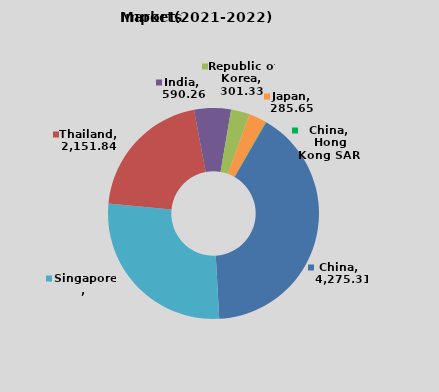
| Category | Series 0 |
|---|---|
| China | 4275.31 |
| Singapore | 2867.77 |
| Thailand | 2151.84 |
| India | 590.26 |
| Republic of  Korea | 301.33 |
| Japan | 285.65 |
| China, Hong Kong SAR | 6.03 |